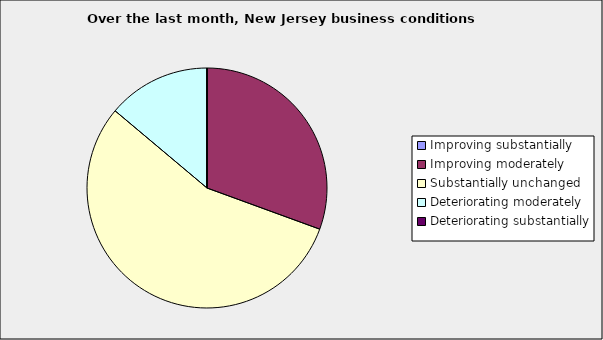
| Category | Series 0 |
|---|---|
| Improving substantially | 0 |
| Improving moderately | 0.306 |
| Substantially unchanged | 0.556 |
| Deteriorating moderately | 0.139 |
| Deteriorating substantially | 0 |